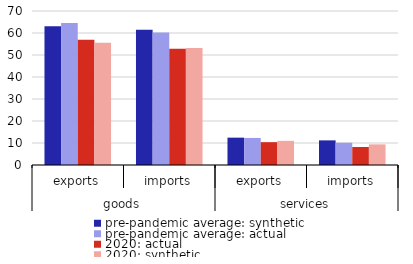
| Category | pre-pandemic average: synthetic | pre-pandemic average: actual  | 2020: actual | 2020: synthetic |
|---|---|---|---|---|
| 0 | 63.093 | 64.492 | 56.951 | 55.55 |
| 1 | 61.491 | 60.171 | 52.883 | 53.126 |
| 2 | 12.432 | 12.301 | 10.381 | 10.976 |
| 3 | 11.195 | 10.134 | 8.174 | 9.367 |